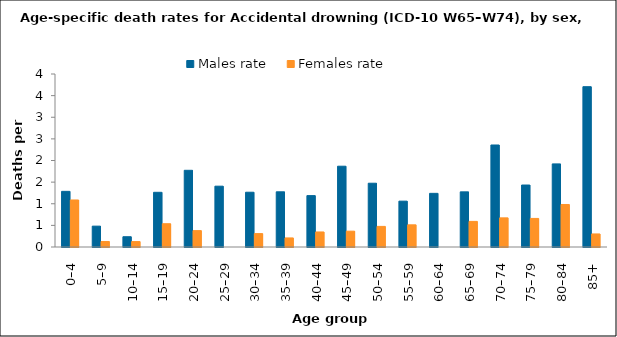
| Category | Males rate | Females rate |
|---|---|---|
| 0–4 | 1.287 | 1.087 |
| 5–9 | 0.482 | 0.128 |
| 10–14 | 0.238 | 0.126 |
| 15–19 | 1.265 | 0.538 |
| 20–24 | 1.773 | 0.379 |
| 25–29 | 1.406 | 0 |
| 30–34 | 1.266 | 0.31 |
| 35–39 | 1.276 | 0.21 |
| 40–44 | 1.188 | 0.348 |
| 45–49 | 1.868 | 0.366 |
| 50–54 | 1.474 | 0.476 |
| 55–59 | 1.06 | 0.513 |
| 60–64 | 1.24 | 0 |
| 65–69 | 1.275 | 0.592 |
| 70–74 | 2.359 | 0.674 |
| 75–79 | 1.433 | 0.661 |
| 80–84 | 1.921 | 0.983 |
| 85+ | 3.707 | 0.302 |